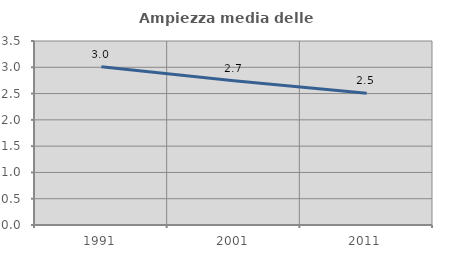
| Category | Ampiezza media delle famiglie |
|---|---|
| 1991.0 | 3.012 |
| 2001.0 | 2.746 |
| 2011.0 | 2.505 |